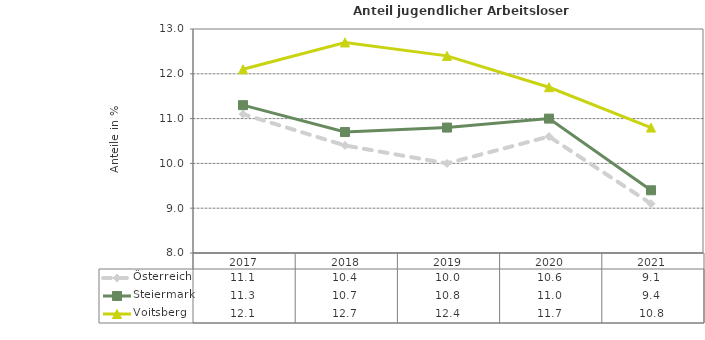
| Category | Österreich | Steiermark | Voitsberg |
|---|---|---|---|
| 2021.0 | 9.1 | 9.4 | 10.8 |
| 2020.0 | 10.6 | 11 | 11.7 |
| 2019.0 | 10 | 10.8 | 12.4 |
| 2018.0 | 10.4 | 10.7 | 12.7 |
| 2017.0 | 11.1 | 11.3 | 12.1 |